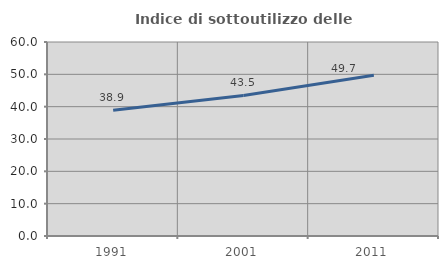
| Category | Indice di sottoutilizzo delle abitazioni  |
|---|---|
| 1991.0 | 38.876 |
| 2001.0 | 43.469 |
| 2011.0 | 49.709 |